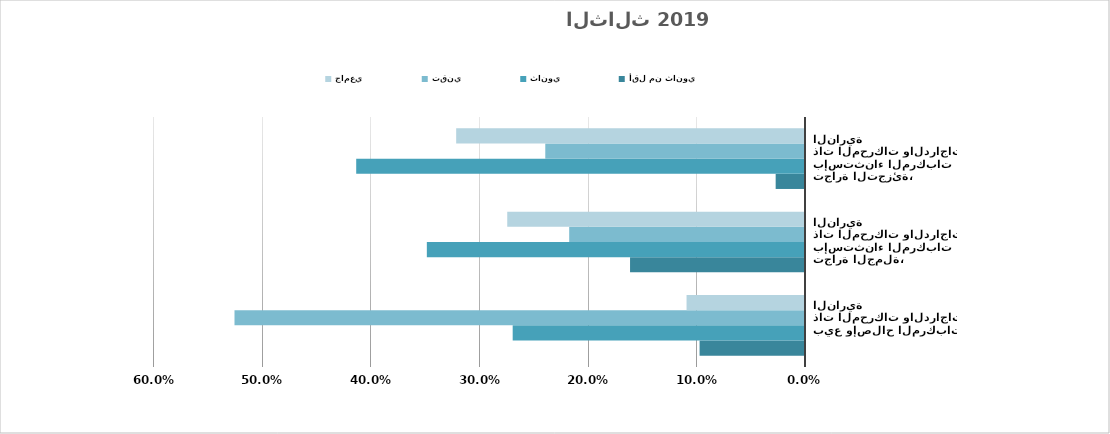
| Category | أقل من ثانوي | ثانوي | تقني | جامعي |
|---|---|---|---|---|
| بيع وإصلاح المركبات ذات المحركات والدراجات النارية | 0.097 | 0.269 | 0.525 | 0.109 |
| تجارة الجملة، بإستثناء المركبات ذات المحركات والدراجات النارية | 0.161 | 0.348 | 0.217 | 0.274 |
| تجارة التجزئة، بإستثناء المركبات ذات المحركات والدراجات النارية | 0.027 | 0.413 | 0.239 | 0.321 |